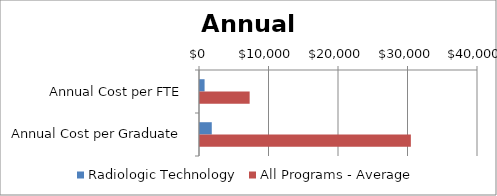
| Category | Radiologic Technology | All Programs - Average |
|---|---|---|
| Annual Cost per FTE | 658.935 | 7144 |
| Annual Cost per Graduate | 1694.404 | 30340 |